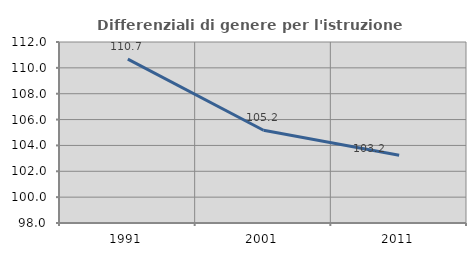
| Category | Differenziali di genere per l'istruzione superiore |
|---|---|
| 1991.0 | 110.671 |
| 2001.0 | 105.171 |
| 2011.0 | 103.243 |